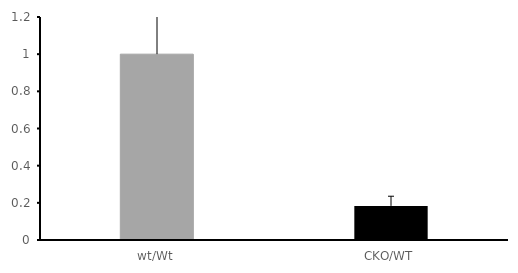
| Category | Series 0 |
|---|---|
| wt/Wt | 1 |
| CKO/WT | 0.183 |